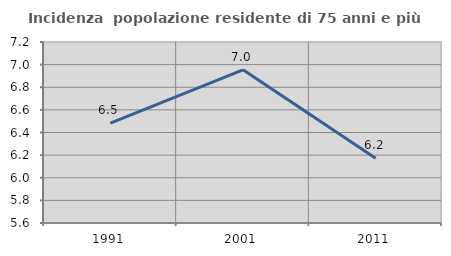
| Category | Incidenza  popolazione residente di 75 anni e più |
|---|---|
| 1991.0 | 6.483 |
| 2001.0 | 6.954 |
| 2011.0 | 6.173 |